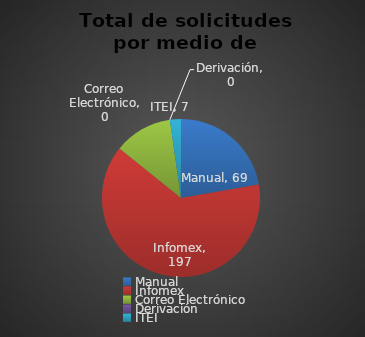
| Category | Series 0 |
|---|---|
| Manual | 69 |
| Infomex | 197 |
| Correo Electrónico | 37 |
| Derivación | 0 |
| ITEI | 7 |